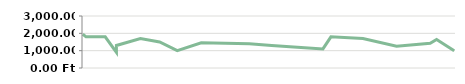
| Category | BEVÉTEL |
|---|---|
| 2013-04-23 | 1950 |
| 2013-04-25 | 1800 |
| 2013-05-07 | 1800 |
| 2013-05-14 | 900 |
| 2013-05-14 | 1300 |
| 2013-05-29 | 1700 |
| 2013-06-10 | 1500 |
| 2013-06-21 | 1000 |
| 2013-07-06 | 1450 |
| 2013-08-05 | 1400 |
| 2013-08-19 | 1300 |
| 2013-09-04 | 1200 |
| 2013-09-20 | 1100 |
| 2013-09-25 | 1800 |
| 2013-10-15 | 1700 |
| 2013-11-05 | 1250 |
| 2013-11-26 | 1425 |
| 2013-11-30 | 1650 |
| 2013-12-11 | 1000 |